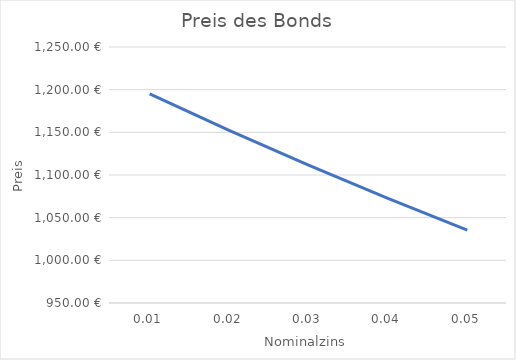
| Category | Preis |
|---|---|
| 0.01 | 1195.098 |
| 0.02 | 1152.309 |
| 0.03 | 1111.513 |
| 0.04 | 1072.598 |
| 0.05 | 1035.46 |